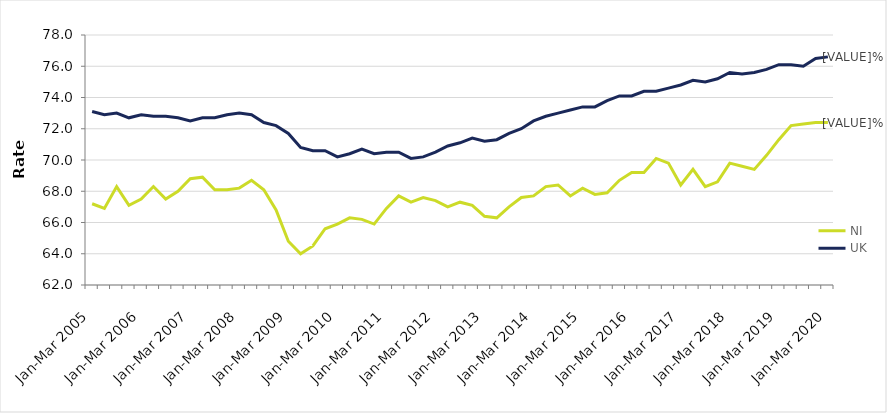
| Category | NI | UK |
|---|---|---|
| Jan-Mar 2005 | 67.2 | 73.1 |
| Apr-Jun 2005 | 66.9 | 72.9 |
| Jul-Sep 2005 | 68.3 | 73 |
| Oct-Dec 2005 | 67.1 | 72.7 |
| Jan-Mar 2006 | 67.5 | 72.9 |
| Apr-Jun 2006 | 68.3 | 72.8 |
| Jul-Sep 2006 | 67.5 | 72.8 |
| Oct-Dec 2006 | 68 | 72.7 |
| Jan-Mar 2007 | 68.8 | 72.5 |
| Apr-Jun 2007 | 68.9 | 72.7 |
| Jul-Sep 2007 | 68.1 | 72.7 |
| Oct-Dec 2007 | 68.1 | 72.9 |
| Jan-Mar 2008 | 68.2 | 73 |
| Apr-Jun 2008 | 68.7 | 72.9 |
| Jul-Sep 2008 | 68.1 | 72.4 |
| Oct-Dec 2008 | 66.8 | 72.2 |
| Jan-Mar 2009 | 64.8 | 71.7 |
| Apr-Jun 2009 | 64 | 70.8 |
| Jul-Sep 2009 | 64.5 | 70.6 |
| Oct-Dec 2009 | 65.6 | 70.6 |
| Jan-Mar 2010 | 65.9 | 70.2 |
| Apr-Jun 2010 | 66.3 | 70.4 |
| Jul-Sep 2010 | 66.2 | 70.7 |
| Oct-Dec 2010 | 65.9 | 70.4 |
| Jan-Mar 2011 | 66.9 | 70.5 |
| Apr-Jun 2011 | 67.7 | 70.5 |
| Jul-Sep 2011 | 67.3 | 70.1 |
| Oct-Dec 2011 | 67.6 | 70.2 |
| Jan-Mar 2012 | 67.4 | 70.5 |
| Apr-Jun 2012 | 67 | 70.9 |
| Jul-Sep 2012 | 67.3 | 71.1 |
| Oct-Dec 2012 | 67.1 | 71.4 |
| Jan-Mar 2013 | 66.4 | 71.2 |
| Apr-Jun 2013 | 66.3 | 71.3 |
| Jul-Sep 2013 | 67 | 71.7 |
| Oct-Dec 2013 | 67.6 | 72 |
| Jan-Mar 2014 | 67.7 | 72.5 |
| Apr-Jun 2014 | 68.3 | 72.8 |
| Jul-Sep 2014 | 68.4 | 73 |
| Oct-Dec 2014 | 67.7 | 73.2 |
| Jan-Mar 2015 | 68.2 | 73.4 |
| Apr-Jun 2015 | 67.8 | 73.4 |
| Jul-Sep 2015 | 67.9 | 73.8 |
| Oct-Dec 2015 | 68.7 | 74.1 |
| Jan-Mar 2016 | 69.2 | 74.1 |
| Apr-Jun 2016 | 69.2 | 74.4 |
| Jul-Sep 2016 | 70.1 | 74.4 |
| Oct-Dec 2016 | 69.8 | 74.6 |
| Jan-Mar 2017 | 68.4 | 74.8 |
| Apr-Jun 2017 | 69.4 | 75.1 |
| Jul-Sep 2017 | 68.3 | 75 |
| Oct-Dec 2017 | 68.6 | 75.2 |
| Jan-Mar 2018 | 69.8 | 75.6 |
| Apr-Jun 2018 | 69.6 | 75.5 |
| Jul-Sep 2018 | 69.4 | 75.6 |
| Oct-Dec 2018 | 70.3 | 75.8 |
| Jan-Mar 2019 | 71.3 | 76.1 |
| Apr-Jun 2019 | 72.2 | 76.1 |
| Jul-Sep 2019 | 72.3 | 76 |
| Oct-Dec 2019 | 72.4 | 76.5 |
| Jan-Mar 2020 | 72.4 | 76.6 |